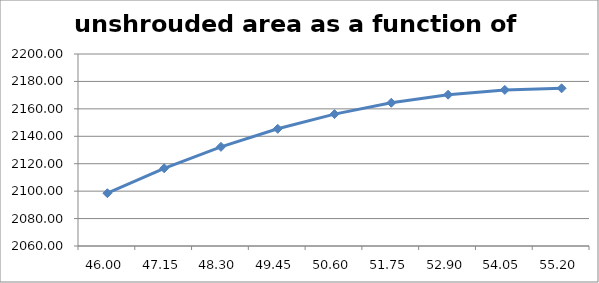
| Category | unshrouded area as a function of valvesize |
|---|---|
| 46.0 | 2098.477 |
| 47.150000000000006 | 2116.677 |
| 48.300000000000004 | 2132.323 |
| 49.45 | 2145.469 |
| 50.60000000000001 | 2156.16 |
| 51.75000000000001 | 2164.431 |
| 52.900000000000006 | 2170.311 |
| 54.05000000000001 | 2173.822 |
| 55.20000000000001 | 2174.984 |